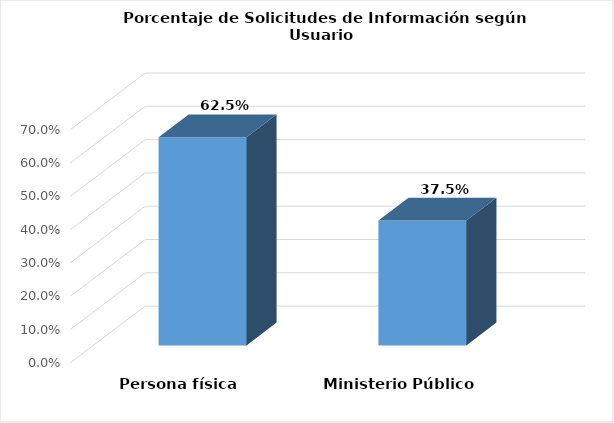
| Category | Series 0 |
|---|---|
| Persona física | 0.625 |
| Ministerio Público | 0.375 |